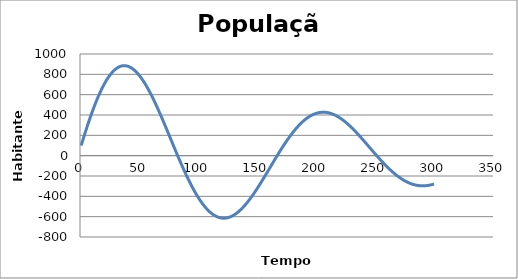
| Category | Series 0 |
|---|---|
| 1.0 | 100 |
| 2.0 | 138 |
| 3.0 | 175.48 |
| 4.0 | 212.392 |
| 5.0 | 248.689 |
| 6.0 | 284.326 |
| 7.0 | 319.258 |
| 8.0 | 353.443 |
| 9.0 | 386.84 |
| 10.0 | 419.407 |
| 11.0 | 451.107 |
| 12.0 | 481.903 |
| 13.0 | 511.76 |
| 14.0 | 540.643 |
| 15.0 | 568.521 |
| 16.0 | 595.363 |
| 17.0 | 621.141 |
| 18.0 | 645.827 |
| 19.0 | 669.398 |
| 20.0 | 691.828 |
| 21.0 | 713.097 |
| 22.0 | 733.184 |
| 23.0 | 752.073 |
| 24.0 | 769.746 |
| 25.0 | 786.189 |
| 26.0 | 801.39 |
| 27.0 | 815.339 |
| 28.0 | 828.026 |
| 29.0 | 839.445 |
| 30.0 | 849.59 |
| 31.0 | 858.459 |
| 32.0 | 866.05 |
| 33.0 | 872.363 |
| 34.0 | 877.4 |
| 35.0 | 881.166 |
| 36.0 | 883.665 |
| 37.0 | 884.906 |
| 38.0 | 884.898 |
| 39.0 | 883.65 |
| 40.0 | 881.177 |
| 41.0 | 877.49 |
| 42.0 | 872.608 |
| 43.0 | 866.545 |
| 44.0 | 859.321 |
| 45.0 | 850.957 |
| 46.0 | 841.473 |
| 47.0 | 830.893 |
| 48.0 | 819.24 |
| 49.0 | 806.541 |
| 50.0 | 792.821 |
| 51.0 | 778.11 |
| 52.0 | 762.436 |
| 53.0 | 745.829 |
| 54.0 | 728.321 |
| 55.0 | 709.944 |
| 56.0 | 690.731 |
| 57.0 | 670.716 |
| 58.0 | 649.934 |
| 59.0 | 628.421 |
| 60.0 | 606.214 |
| 61.0 | 583.348 |
| 62.0 | 559.863 |
| 63.0 | 535.795 |
| 64.0 | 511.185 |
| 65.0 | 486.071 |
| 66.0 | 460.492 |
| 67.0 | 434.488 |
| 68.0 | 408.1 |
| 69.0 | 381.367 |
| 70.0 | 354.33 |
| 71.0 | 327.03 |
| 72.0 | 299.507 |
| 73.0 | 271.801 |
| 74.0 | 243.953 |
| 75.0 | 216.003 |
| 76.0 | 187.99 |
| 77.0 | 159.956 |
| 78.0 | 131.938 |
| 79.0 | 103.977 |
| 80.0 | 76.111 |
| 81.0 | 48.378 |
| 82.0 | 20.816 |
| 83.0 | -6.539 |
| 84.0 | -33.649 |
| 85.0 | -60.479 |
| 86.0 | -86.993 |
| 87.0 | -113.158 |
| 88.0 | -138.939 |
| 89.0 | -164.304 |
| 90.0 | -189.221 |
| 91.0 | -213.658 |
| 92.0 | -237.586 |
| 93.0 | -260.976 |
| 94.0 | -283.8 |
| 95.0 | -306.029 |
| 96.0 | -327.64 |
| 97.0 | -348.605 |
| 98.0 | -368.902 |
| 99.0 | -388.509 |
| 100.0 | -407.402 |
| 101.0 | -425.563 |
| 102.0 | -442.972 |
| 103.0 | -459.611 |
| 104.0 | -475.463 |
| 105.0 | -490.514 |
| 106.0 | -504.748 |
| 107.0 | -518.154 |
| 108.0 | -530.718 |
| 109.0 | -542.432 |
| 110.0 | -553.285 |
| 111.0 | -563.27 |
| 112.0 | -572.381 |
| 113.0 | -580.613 |
| 114.0 | -587.96 |
| 115.0 | -594.421 |
| 116.0 | -599.995 |
| 117.0 | -604.681 |
| 118.0 | -608.479 |
| 119.0 | -611.394 |
| 120.0 | -613.427 |
| 121.0 | -614.584 |
| 122.0 | -614.87 |
| 123.0 | -614.294 |
| 124.0 | -612.862 |
| 125.0 | -610.584 |
| 126.0 | -607.472 |
| 127.0 | -603.535 |
| 128.0 | -598.788 |
| 129.0 | -593.243 |
| 130.0 | -586.915 |
| 131.0 | -579.82 |
| 132.0 | -571.974 |
| 133.0 | -563.395 |
| 134.0 | -554.101 |
| 135.0 | -544.111 |
| 136.0 | -533.445 |
| 137.0 | -522.124 |
| 138.0 | -510.17 |
| 139.0 | -497.604 |
| 140.0 | -484.45 |
| 141.0 | -470.73 |
| 142.0 | -456.47 |
| 143.0 | -441.693 |
| 144.0 | -426.424 |
| 145.0 | -410.69 |
| 146.0 | -394.517 |
| 147.0 | -377.93 |
| 148.0 | -360.957 |
| 149.0 | -343.624 |
| 150.0 | -325.959 |
| 151.0 | -307.99 |
| 152.0 | -289.744 |
| 153.0 | -271.25 |
| 154.0 | -252.535 |
| 155.0 | -233.627 |
| 156.0 | -214.554 |
| 157.0 | -195.346 |
| 158.0 | -176.029 |
| 159.0 | -156.632 |
| 160.0 | -137.182 |
| 161.0 | -117.708 |
| 162.0 | -98.236 |
| 163.0 | -78.794 |
| 164.0 | -59.409 |
| 165.0 | -40.107 |
| 166.0 | -20.916 |
| 167.0 | -1.86 |
| 168.0 | 17.034 |
| 169.0 | 35.743 |
| 170.0 | 54.24 |
| 171.0 | 72.502 |
| 172.0 | 90.506 |
| 173.0 | 108.228 |
| 174.0 | 125.646 |
| 175.0 | 142.739 |
| 176.0 | 159.485 |
| 177.0 | 175.863 |
| 178.0 | 191.854 |
| 179.0 | 207.44 |
| 180.0 | 222.6 |
| 181.0 | 237.319 |
| 182.0 | 251.579 |
| 183.0 | 265.364 |
| 184.0 | 278.659 |
| 185.0 | 291.45 |
| 186.0 | 303.722 |
| 187.0 | 315.464 |
| 188.0 | 326.663 |
| 189.0 | 337.309 |
| 190.0 | 347.39 |
| 191.0 | 356.899 |
| 192.0 | 365.826 |
| 193.0 | 374.165 |
| 194.0 | 381.907 |
| 195.0 | 389.049 |
| 196.0 | 395.584 |
| 197.0 | 401.51 |
| 198.0 | 406.822 |
| 199.0 | 411.519 |
| 200.0 | 415.6 |
| 201.0 | 419.063 |
| 202.0 | 421.911 |
| 203.0 | 424.143 |
| 204.0 | 425.762 |
| 205.0 | 426.771 |
| 206.0 | 427.174 |
| 207.0 | 426.975 |
| 208.0 | 426.18 |
| 209.0 | 424.796 |
| 210.0 | 422.828 |
| 211.0 | 420.286 |
| 212.0 | 417.177 |
| 213.0 | 413.511 |
| 214.0 | 409.297 |
| 215.0 | 404.547 |
| 216.0 | 399.271 |
| 217.0 | 393.482 |
| 218.0 | 387.191 |
| 219.0 | 380.412 |
| 220.0 | 373.16 |
| 221.0 | 365.447 |
| 222.0 | 357.288 |
| 223.0 | 348.7 |
| 224.0 | 339.698 |
| 225.0 | 330.297 |
| 226.0 | 320.515 |
| 227.0 | 310.368 |
| 228.0 | 299.874 |
| 229.0 | 289.05 |
| 230.0 | 277.915 |
| 231.0 | 266.486 |
| 232.0 | 254.783 |
| 233.0 | 242.823 |
| 234.0 | 230.627 |
| 235.0 | 218.212 |
| 236.0 | 205.599 |
| 237.0 | 192.807 |
| 238.0 | 179.854 |
| 239.0 | 166.761 |
| 240.0 | 153.547 |
| 241.0 | 140.232 |
| 242.0 | 126.835 |
| 243.0 | 113.376 |
| 244.0 | 99.874 |
| 245.0 | 86.348 |
| 246.0 | 72.817 |
| 247.0 | 59.301 |
| 248.0 | 45.818 |
| 249.0 | 32.387 |
| 250.0 | 19.026 |
| 251.0 | 5.753 |
| 252.0 | -7.413 |
| 253.0 | -20.456 |
| 254.0 | -33.358 |
| 255.0 | -46.103 |
| 256.0 | -58.673 |
| 257.0 | -71.053 |
| 258.0 | -83.227 |
| 259.0 | -95.18 |
| 260.0 | -106.897 |
| 261.0 | -118.364 |
| 262.0 | -129.566 |
| 263.0 | -140.49 |
| 264.0 | -151.124 |
| 265.0 | -161.455 |
| 266.0 | -171.471 |
| 267.0 | -181.16 |
| 268.0 | -190.513 |
| 269.0 | -199.519 |
| 270.0 | -208.168 |
| 271.0 | -216.45 |
| 272.0 | -224.359 |
| 273.0 | -231.886 |
| 274.0 | -239.023 |
| 275.0 | -245.764 |
| 276.0 | -252.103 |
| 277.0 | -258.035 |
| 278.0 | -263.555 |
| 279.0 | -268.658 |
| 280.0 | -273.341 |
| 281.0 | -277.601 |
| 282.0 | -281.435 |
| 283.0 | -284.843 |
| 284.0 | -287.823 |
| 285.0 | -290.374 |
| 286.0 | -292.497 |
| 287.0 | -294.192 |
| 288.0 | -295.46 |
| 289.0 | -296.304 |
| 290.0 | -296.726 |
| 291.0 | -296.729 |
| 292.0 | -296.316 |
| 293.0 | -295.492 |
| 294.0 | -294.261 |
| 295.0 | -292.63 |
| 296.0 | -290.602 |
| 297.0 | -288.185 |
| 298.0 | -285.385 |
| 299.0 | -282.21 |
| 300.0 | -278.667 |